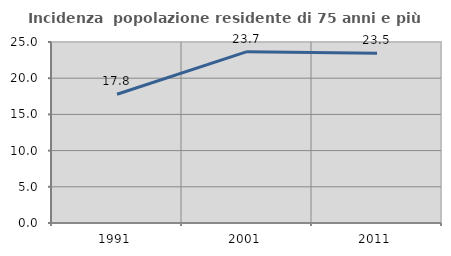
| Category | Incidenza  popolazione residente di 75 anni e più |
|---|---|
| 1991.0 | 17.787 |
| 2001.0 | 23.664 |
| 2011.0 | 23.45 |